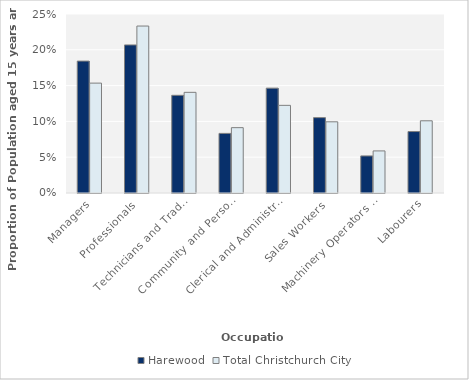
| Category | Harewood | Total Christchurch City |
|---|---|---|
| Managers | 0.184 | 0.153 |
| Professionals | 0.207 | 0.233 |
| Technicians and Trades Workers | 0.136 | 0.141 |
| Community and Personal Service Workers | 0.083 | 0.091 |
| Clerical and Administrative Workers | 0.146 | 0.122 |
| Sales Workers | 0.105 | 0.099 |
| Machinery Operators and Drivers | 0.052 | 0.059 |
| Labourers | 0.086 | 0.101 |